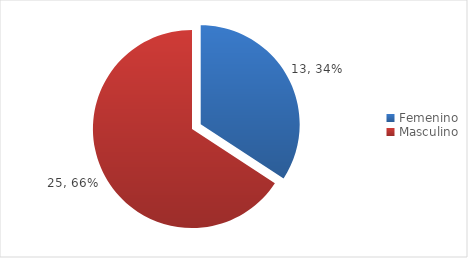
| Category | Series 0 |
|---|---|
| Femenino | 13 |
| Masculino | 25 |